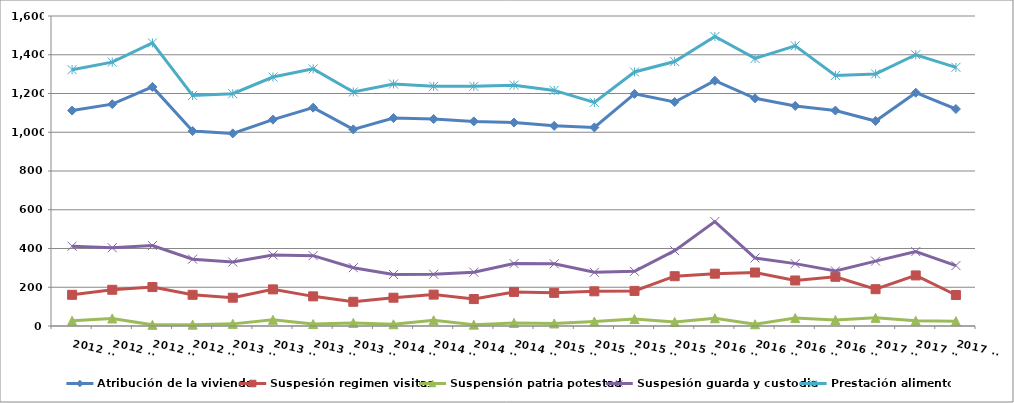
| Category | Atribución de la vivienda | Suspesión regimen visitas | Suspensión patria potestad | Suspesión guarda y custodia | Prestación alimentos |
|---|---|---|---|---|---|
| 2012 T1 | 1112 | 161 | 27 | 412 | 1323 |
| 2012 T2 | 1145 | 187 | 39 | 404 | 1362 |
| 2012 T3 | 1234 | 201 | 6 | 415 | 1461 |
| 2012 T4 | 1006 | 161 | 7 | 345 | 1190 |
| 2013 T1 | 994 | 146 | 11 | 330 | 1199 |
| 2013 T2 | 1065 | 189 | 32 | 366 | 1285 |
| 2013 T3 | 1127 | 153 | 10 | 363 | 1327 |
| 2013 T4 | 1015 | 125 | 16 | 301 | 1208 |
| 2014 T1 | 1073 | 146 | 9 | 266 | 1249 |
| 2014 T2 | 1068 | 162 | 30 | 267 | 1237 |
| 2014 T3 | 1056 | 139 | 7 | 278 | 1237 |
| 2014 T4 | 1050 | 176 | 16 | 322 | 1243 |
| 2015 T1 | 1033 | 171 | 13 | 321 | 1216 |
| 2015 T2 | 1025 | 179 | 23 | 277 | 1154 |
| 2015 T3 | 1198 | 181 | 36 | 282 | 1311 |
| 2015 T4 | 1156 | 257 | 21 | 389 | 1365 |
| 2016 T1 | 1266 | 270 | 40 | 539 | 1494 |
| 2016 T2 | 1175 | 276 | 9 | 351 | 1381 |
| 2016 T3 | 1136 | 235 | 41 | 322 | 1446 |
| 2016 T4 | 1112 | 254 | 31 | 284 | 1293 |
| 2017 T1 | 1058 | 190 | 42 | 335 | 1301 |
| 2017 T2 | 1204 | 261 | 27 | 384 | 1400 |
| 2017 T3 | 1120 | 160 | 25 | 312 | 1335 |